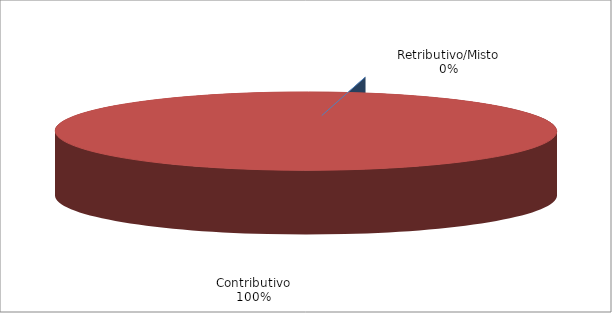
| Category | Series 1 |
|---|---|
| Retributivo/Misto | 0 |
| Contributivo | 6755 |